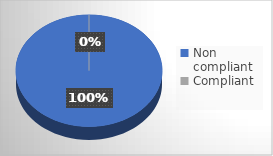
| Category | Series 0 |
|---|---|
| Non compliant | 64 |
| Compliant | 0 |